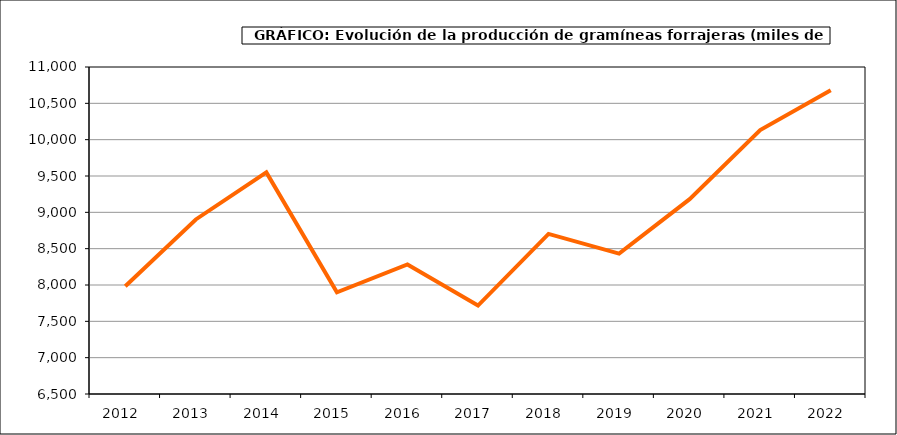
| Category | Superficie |
|---|---|
| 2012.0 | 7983.127 |
| 2013.0 | 8902.06 |
| 2014.0 | 9549.995 |
| 2015.0 | 7898.371 |
| 2016.0 | 8282.503 |
| 2017.0 | 7716.979 |
| 2018.0 | 8703.004 |
| 2019.0 | 8431.164 |
| 2020.0 | 9180.714 |
| 2021.0 | 10133.152 |
| 2022.0 | 10679.204 |